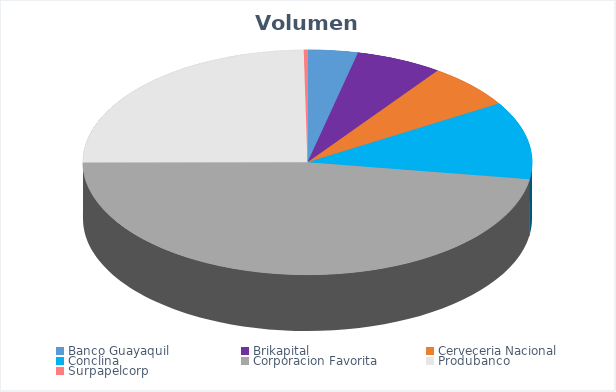
| Category | VOLUMEN ($USD) |
|---|---|
| Banco Guayaquil | 5807.04 |
| Brikapital | 10000 |
| Cerveceria Nacional | 10340 |
| Conclina | 17999 |
| Corporacion Favorita | 76569.96 |
| Produbanco | 39883.36 |
| Surpapelcorp | 425 |